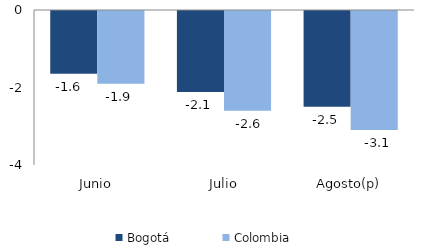
| Category | Bogotá | Colombia |
|---|---|---|
| Junio | -1.62 | -1.874 |
| Julio | -2.088 | -2.572 |
| Agosto(p) | -2.469 | -3.07 |